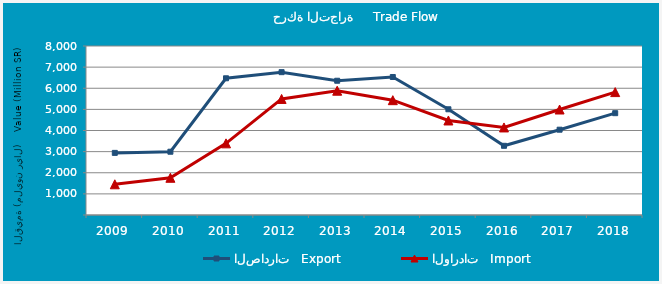
| Category | الصادرات   Export | الواردات   Import |
|---|---|---|
| 2009.0 | 2940229885 | 1453409308 |
| 2010.0 | 2995222920 | 1761555959 |
| 2011.0 | 6471285372 | 3391882347 |
| 2012.0 | 6761591647 | 5493367318 |
| 2013.0 | 6355373125 | 5883363285 |
| 2014.0 | 6532768327 | 5435374641 |
| 2015.0 | 5004713901 | 4474251310 |
| 2016.0 | 3275427329 | 4144484740 |
| 2017.0 | 4038036240 | 4993645464 |
| 2018.0 | 4820232682 | 5817659708 |